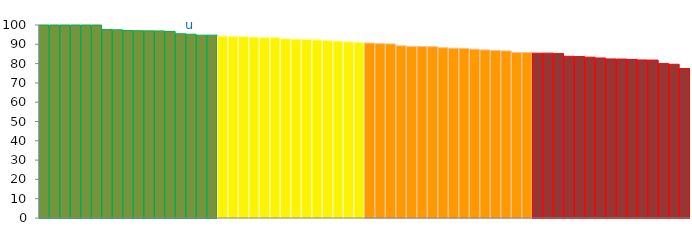
| Category | Top Quartile | 2nd Quartile | 3rd Quartile | Bottom Quartile | Series 4 |
|---|---|---|---|---|---|
|  | 100 | 0 | 0 | 0 | 100 |
|  | 100 | 0 | 0 | 0 | 100 |
|  | 100 | 0 | 0 | 0 | 100 |
|  | 100 | 0 | 0 | 0 | 100 |
|  | 100 | 0 | 0 | 0 | 100 |
|  | 100 | 0 | 0 | 0 | 100 |
|  | 97.647 | 0 | 0 | 0 | 97.647 |
|  | 97.5 | 0 | 0 | 0 | 97.5 |
|  | 97.143 | 0 | 0 | 0 | 97.143 |
|  | 97.059 | 0 | 0 | 0 | 97.059 |
|  | 96.97 | 0 | 0 | 0 | 96.97 |
|  | 96.923 | 0 | 0 | 0 | 96.923 |
|  | 96.667 | 0 | 0 | 0 | 96.667 |
|  | 95.455 | 0 | 0 | 0 | 95.455 |
| u | 95.238 | 0 | 0 | 0 | 95.238 |